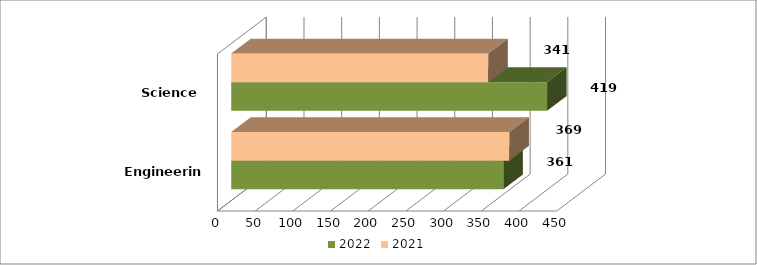
| Category | 2022 | 2021 |
|---|---|---|
| Engineering | 361 | 369 |
| Science | 419 | 341 |